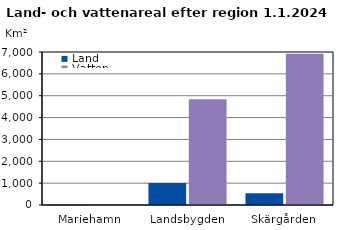
| Category | Land | Vatten |
|---|---|---|
| Mariehamn | 11.83 | 8.93 |
| Landsbygden | 1007.51 | 4838.1 |
| Skärgården | 536.25 | 6921.89 |